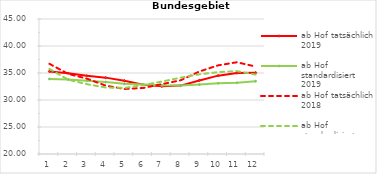
| Category | ab Hof tatsächlich 2019 | ab Hof standardisiert 2019 | ab Hof tatsächlich 2018 | ab Hof standardisiert 2018 |
|---|---|---|---|---|
| 0 | 35.286 | 33.891 | 36.705 | 35.768 |
| 1 | 34.969 | 33.787 | 34.842 | 33.768 |
| 2 | 34.493 | 33.543 | 33.957 | 32.93 |
| 3 | 34.142 | 33.326 | 32.67 | 32.322 |
| 4 | 33.578 | 33.002 | 32.044 | 32.226 |
| 5 | 32.835 | 32.878 | 32.225 | 32.764 |
| 6 | 32.534 | 32.726 | 32.935 | 33.414 |
| 7 | 32.668 | 32.68 | 33.649 | 34.129 |
| 8 | 33.627 | 32.855 | 35.278 | 34.763 |
| 9 | 34.51 | 33.096 | 36.415 | 35.157 |
| 10 | 34.979 | 33.185 | 36.99 | 35.351 |
| 11 | 35.065 | 33.475 | 36.198 | 34.705 |